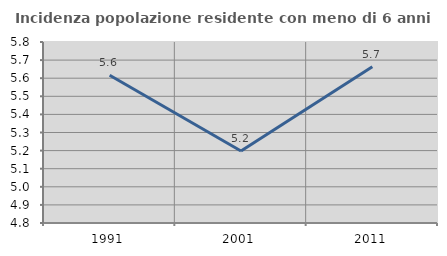
| Category | Incidenza popolazione residente con meno di 6 anni |
|---|---|
| 1991.0 | 5.617 |
| 2001.0 | 5.198 |
| 2011.0 | 5.664 |